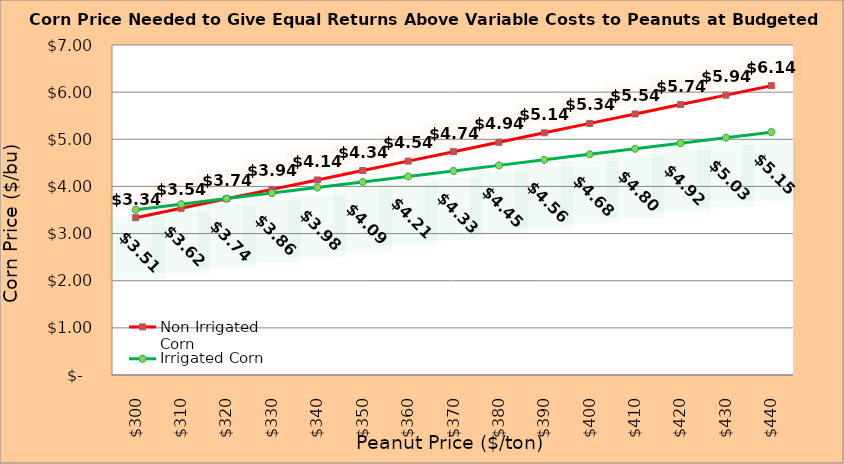
| Category | Non Irrigated Corn | Irrigated Corn |
|---|---|---|
| 299.8936170212766 | 3.337 | 3.507 |
| 309.8936170212766 | 3.537 | 3.624 |
| 319.8936170212766 | 3.737 | 3.742 |
| 329.8936170212766 | 3.937 | 3.859 |
| 339.8936170212766 | 4.137 | 3.977 |
| 349.8936170212766 | 4.337 | 4.094 |
| 359.8936170212766 | 4.537 | 4.212 |
| 369.8936170212766 | 4.737 | 4.329 |
| 379.8936170212766 | 4.937 | 4.447 |
| 389.8936170212766 | 5.137 | 4.564 |
| 399.8936170212766 | 5.337 | 4.682 |
| 409.8936170212766 | 5.537 | 4.799 |
| 419.8936170212766 | 5.737 | 4.917 |
| 429.8936170212766 | 5.937 | 5.034 |
| 439.8936170212766 | 6.137 | 5.152 |